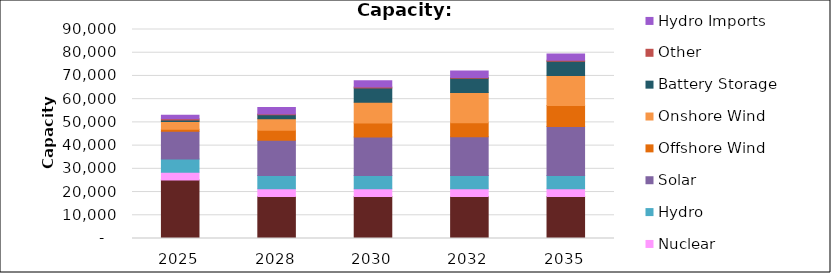
| Category | Gas & FO | Zero-Carbon Firm Resources | Nuclear | Hydro | Solar | Offshore Wind | Onshore Wind | Battery Storage | Other | Hydro Imports |
|---|---|---|---|---|---|---|---|---|---|---|
| 2025.0 | 25145.8 | 0 | 3333.6 | 5704.75 | 11986.19 | 924 | 3297.24 | 676.5 | 475.95 | 1485 |
| 2028.0 | 18133.36 | 0 | 3333.6 | 5704.75 | 15128.35 | 4300 | 4966.86 | 1711.5 | 369.65 | 2735 |
| 2030.0 | 18133.36 | 0 | 3333.6 | 5704.75 | 16564.35 | 6000 | 8966.86 | 6150 | 369.65 | 2735 |
| 2032.0 | 18133.36 | 0 | 3333.6 | 5704.75 | 16684.91 | 6000 | 12966.86 | 6150 | 369.65 | 2735 |
| 2035.0 | 18133.36 | 0 | 3333.6 | 5704.75 | 21078.38 | 9000 | 12966.86 | 6150 | 369.65 | 2735 |